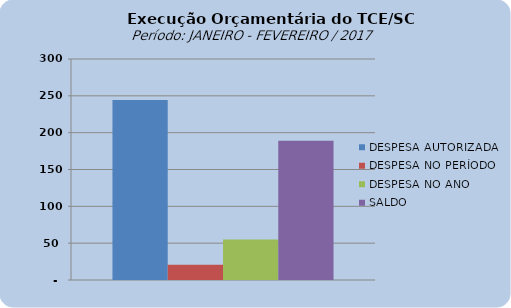
| Category | DESPESA AUTORIZADA | DESPESA NO PERÍODO | DESPESA NO ANO | SALDO |
|---|---|---|---|---|
| 0 | 244282728.67 | 20842030.06 | 55145554.29 | 189137174.38 |